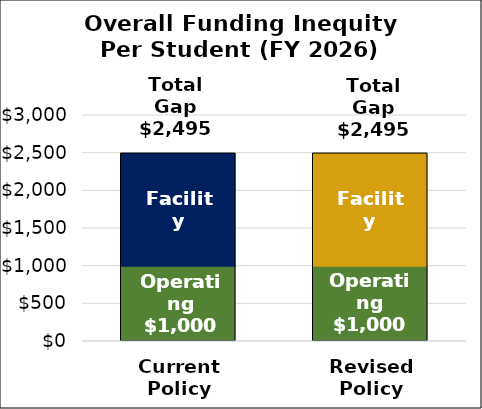
| Category | Operating | Facility |
|---|---|---|
| Current
Policy | 1000 | 1494.767 |
| Revised
Policy | 1000 | 1494.767 |